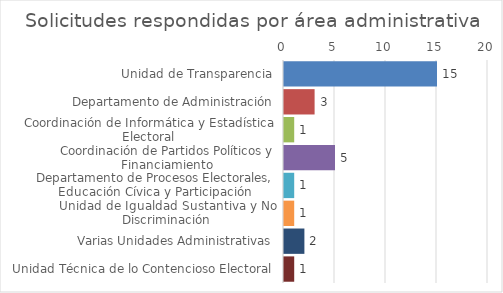
| Category | Series 0 |
|---|---|
| Unidad de Transparencia | 15 |
| Departamento de Administración | 3 |
| Coordinación de Informática y Estadística Electoral | 1 |
| Coordinación de Partidos Políticos y Financiamiento | 5 |
| Departamento de Procesos Electorales, Educación Cívica y Participación Ciudadana | 1 |
| Unidad de Igualdad Sustantiva y No Discriminación | 1 |
| Varias Unidades Administrativas | 2 |
| Unidad Técnica de lo Contencioso Electoral | 1 |